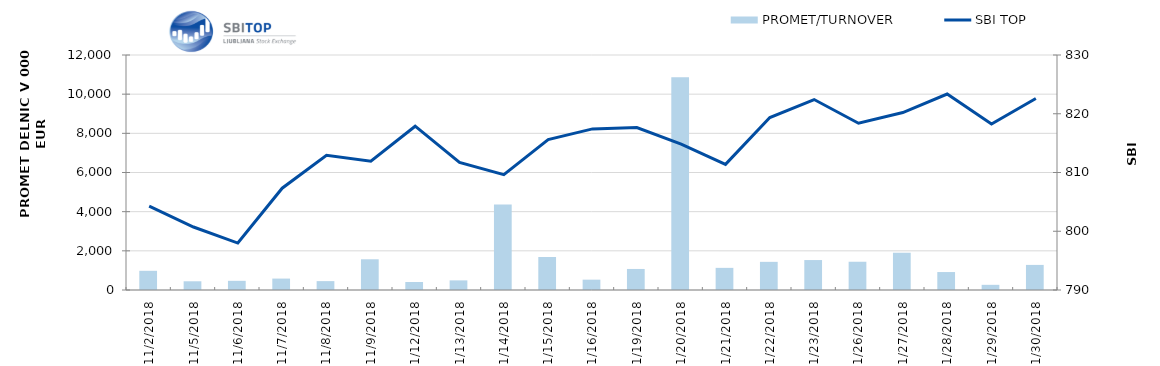
| Category | PROMET/TURNOVER |
|---|---|
| 11/2/18 | 980 |
| 11/5/18 | 445 |
| 11/6/18 | 468 |
| 11/7/18 | 583 |
| 11/8/18 | 453 |
| 11/9/18 | 1568 |
| 11/12/18 | 409 |
| 11/13/18 | 491 |
| 11/14/18 | 4366 |
| 11/15/18 | 1686 |
| 11/16/18 | 528 |
| 11/19/18 | 1074 |
| 11/20/18 | 10863 |
| 11/21/18 | 1130 |
| 11/22/18 | 1437 |
| 11/23/18 | 1529 |
| 11/26/18 | 1443 |
| 11/27/18 | 1903 |
| 11/28/18 | 917 |
| 11/29/18 | 264 |
| 11/30/18 | 1281 |